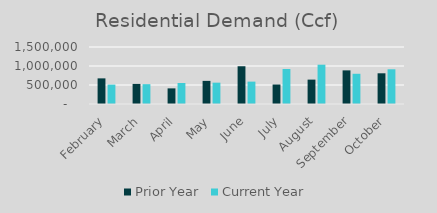
| Category | Prior Year | Current Year |
|---|---|---|
| February | 674439.428 | 510296.309 |
| March | 528549.791 | 521893.674 |
| April | 411179.62 | 552550.404 |
| May | 608563.54 | 561680.927 |
| June | 993563.54 | 588815.728 |
| July | 512849.55 | 920418.723 |
| August | 641515.25 | 1034271.241 |
| September | 884745.885 | 795392.365 |
| October | 808030.57 | 913450.318 |